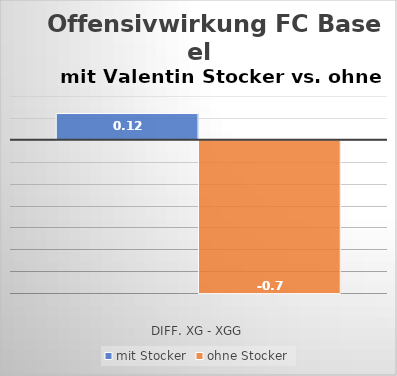
| Category | mit Stocker | ohne Stocker |
|---|---|---|
| Diff. xG - xGG | 0.12 | -0.7 |